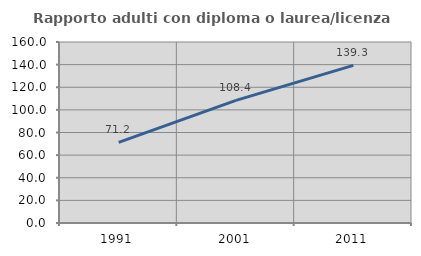
| Category | Rapporto adulti con diploma o laurea/licenza media  |
|---|---|
| 1991.0 | 71.193 |
| 2001.0 | 108.387 |
| 2011.0 | 139.339 |